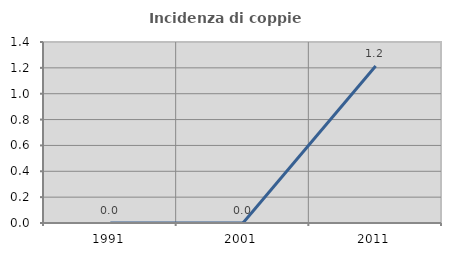
| Category | Incidenza di coppie miste |
|---|---|
| 1991.0 | 0 |
| 2001.0 | 0 |
| 2011.0 | 1.215 |